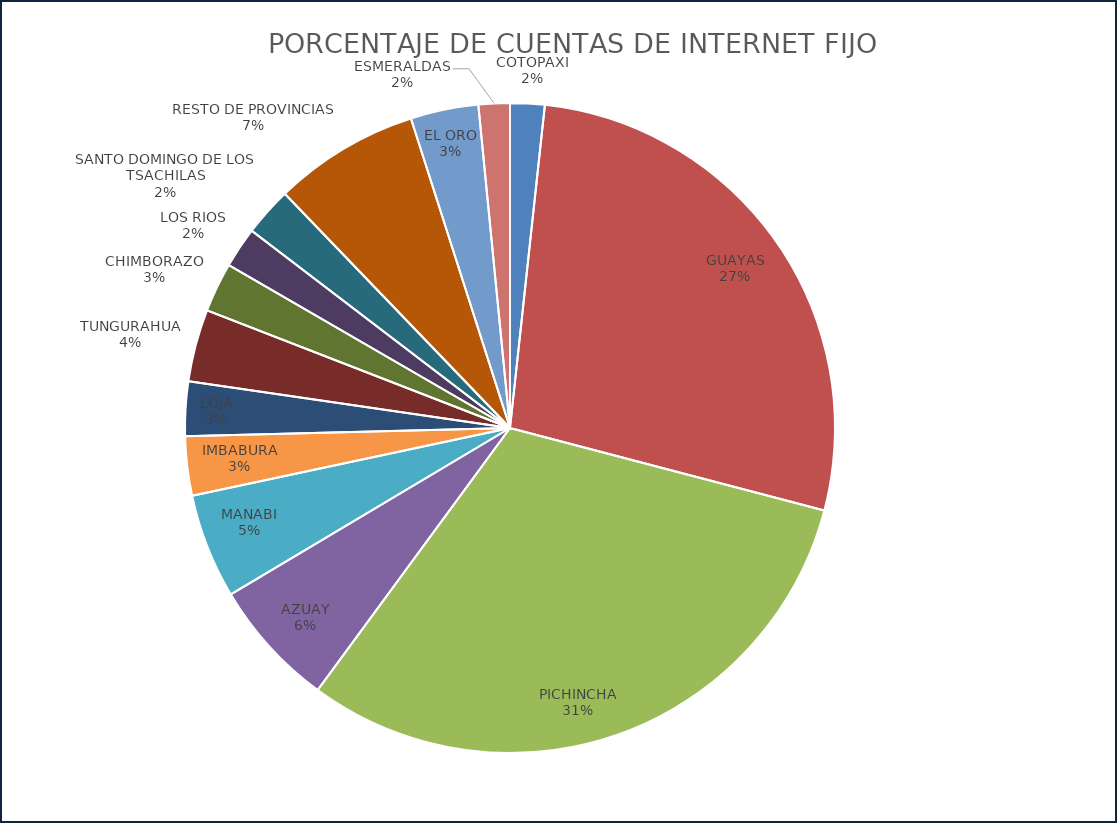
| Category | PORCENTAJE DE CUENTAS DE INTERNET FIJO |
|---|---|
| COTOPAXI | 0.017 |
| GUAYAS | 0.274 |
| PICHINCHA | 0.31 |
| AZUAY | 0.064 |
| MANABI | 0.052 |
| IMBABURA | 0.029 |
| LOJA | 0.027 |
| TUNGURAHUA | 0.036 |
| CHIMBORAZO | 0.025 |
| LOS RIOS | 0.02 |
| SANTO DOMINGO DE LOS TSACHILAS | 0.024 |
| RESTO DE PROVINCIAS | 0.073 |
| EL ORO | 0.034 |
| ESMERALDAS | 0.016 |